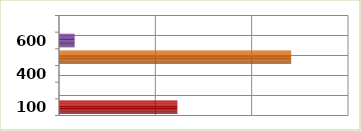
| Category | Series 0 |
|---|---|
| 100.0 | 61434787 |
| 200.0 | 0 |
| 400.0 | 0 |
| 500.0 | 120493399 |
| 600.0 | 8099514 |
| 700.0 | 0 |